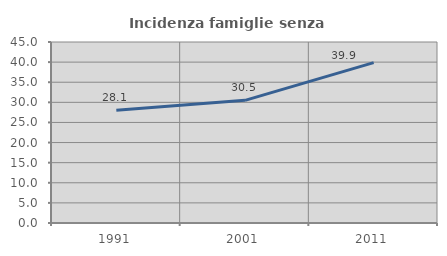
| Category | Incidenza famiglie senza nuclei |
|---|---|
| 1991.0 | 28.058 |
| 2001.0 | 30.496 |
| 2011.0 | 39.86 |